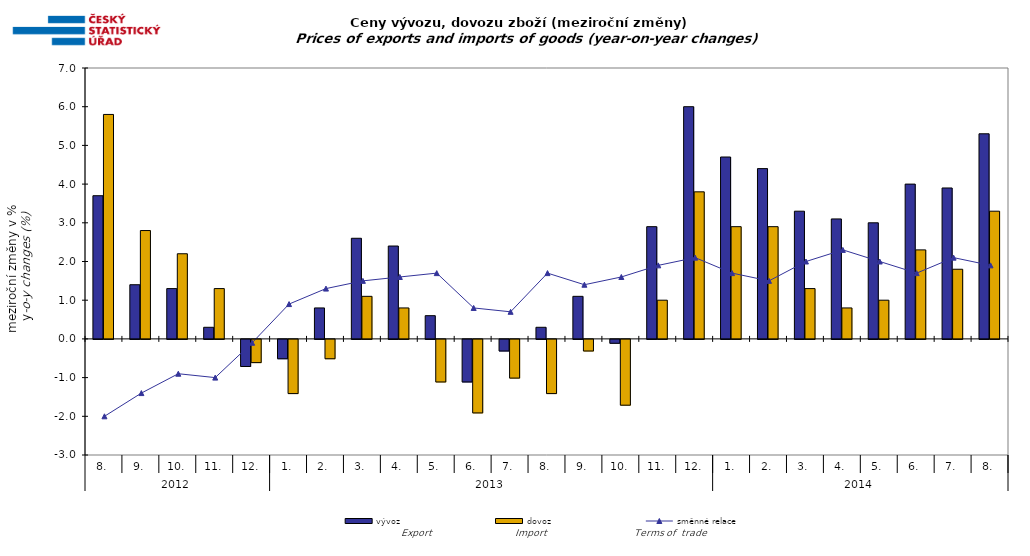
| Category | vývoz | dovoz |
|---|---|---|
| 0 | 3.7 | 5.8 |
| 1 | 1.4 | 2.8 |
| 2 | 1.3 | 2.2 |
| 3 | 0.3 | 1.3 |
| 4 | -0.7 | -0.6 |
| 5 | -0.5 | -1.4 |
| 6 | 0.8 | -0.5 |
| 7 | 2.6 | 1.1 |
| 8 | 2.4 | 0.8 |
| 9 | 0.6 | -1.1 |
| 10 | -1.1 | -1.9 |
| 11 | -0.3 | -1 |
| 12 | 0.3 | -1.4 |
| 13 | 1.1 | -0.3 |
| 14 | -0.1 | -1.7 |
| 15 | 2.9 | 1 |
| 16 | 6 | 3.8 |
| 17 | 4.7 | 2.9 |
| 18 | 4.4 | 2.9 |
| 19 | 3.3 | 1.3 |
| 20 | 3.1 | 0.8 |
| 21 | 3 | 1 |
| 22 | 4 | 2.3 |
| 23 | 3.9 | 1.8 |
| 24 | 5.3 | 3.3 |